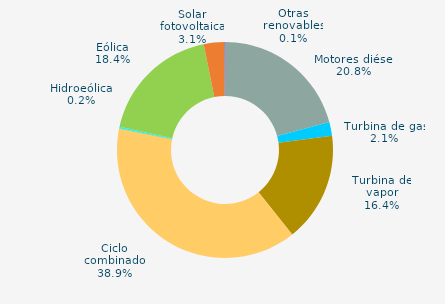
| Category | Series 0 |
|---|---|
| Motores diésel | 20.826 |
| Turbina de gas | 2.054 |
| Turbina de vapor | 16.426 |
| Ciclo combinado | 38.885 |
| Cogeneración | 0 |
| Hidráulica | 0.038 |
| Hidroeólica | 0.23 |
| Eólica | 18.37 |
| Solar fotovoltaica | 3.062 |
| Otras renovables | 0.109 |